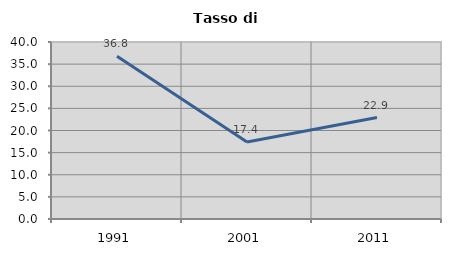
| Category | Tasso di disoccupazione   |
|---|---|
| 1991.0 | 36.763 |
| 2001.0 | 17.384 |
| 2011.0 | 22.926 |